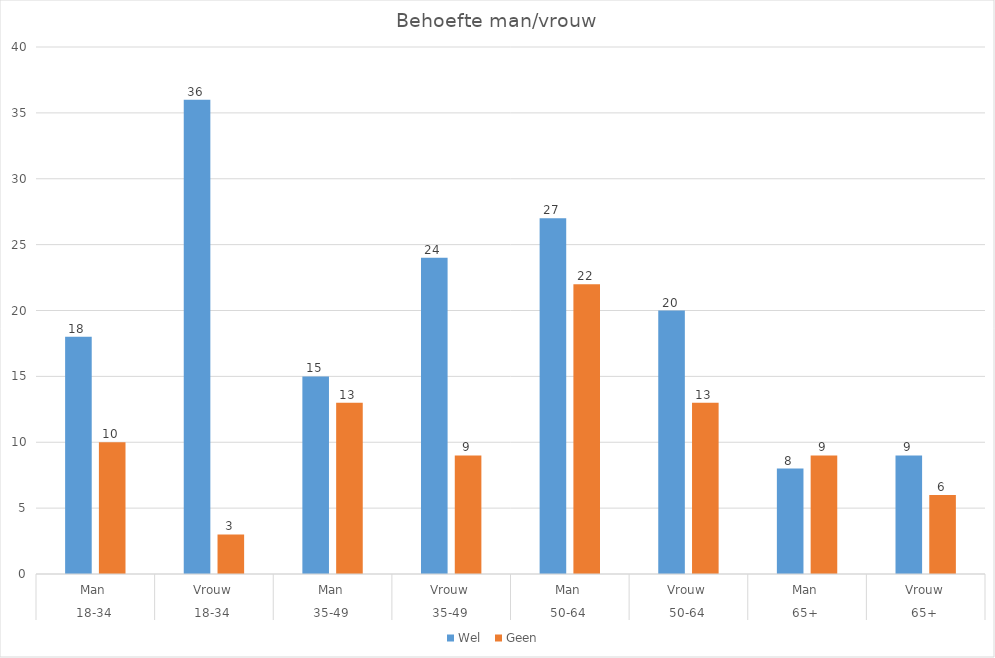
| Category | Wel  | Geen  |
|---|---|---|
| 0 | 18 | 10 |
| 1 | 36 | 3 |
| 2 | 15 | 13 |
| 3 | 24 | 9 |
| 4 | 27 | 22 |
| 5 | 20 | 13 |
| 6 | 8 | 9 |
| 7 | 9 | 6 |